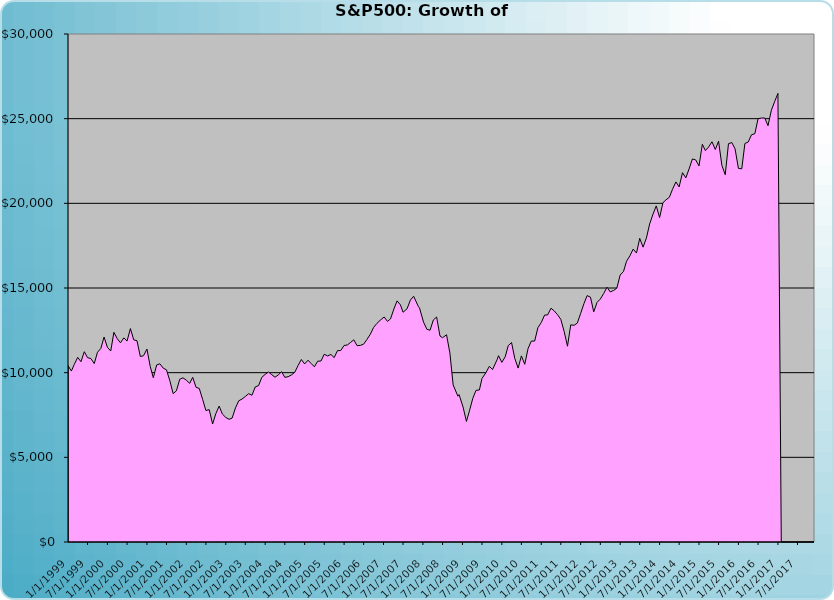
| Category | S&P500 |
|---|---|
| 12/1/17 | 0 |
| 11/1/17 | 0 |
| 10/1/17 | 0 |
| 9/1/17 | 0 |
| 8/1/17 | 0 |
| 7/1/17 | 0 |
| 6/1/17 | 0 |
| 5/1/17 | 0 |
| 4/1/17 | 0 |
| 3/1/17 | 0 |
| 2/1/17 | 0 |
| 1/1/17 | 26493.548 |
| 12/1/16 | 25999.557 |
| 11/1/16 | 25494.761 |
| 10/1/16 | 24585.111 |
| 9/1/16 | 25040.855 |
| 8/1/16 | 25035.848 |
| 7/1/16 | 25000.847 |
| 6/1/16 | 24111.145 |
| 5/1/16 | 24048.619 |
| 4/1/16 | 23623.398 |
| 3/1/16 | 23531.624 |
| 2/1/16 | 22037.483 |
| 1/1/16 | 22066.169 |
| 12/1/15 | 23217.771 |
| 11/1/15 | 23590.5 |
| 10/1/15 | 23519.941 |
| 9/1/15 | 21689.359 |
| 8/1/15 | 22238.653 |
| 7/1/15 | 23665.695 |
| 6/1/15 | 23178.937 |
| 5/1/15 | 23637.505 |
| 4/1/15 | 23336.464 |
| 3/1/15 | 23114.565 |
| 2/1/15 | 23485.638 |
| 1/1/15 | 22208.641 |
| 12/1/14 | 22565.171 |
| 11/1/14 | 22621.725 |
| 10/1/14 | 22029.141 |
| 9/1/14 | 21504.433 |
| 8/1/14 | 21809.77 |
| 7/1/14 | 20970.932 |
| 6/1/14 | 21264.381 |
| 5/1/14 | 20833.135 |
| 4/1/14 | 20354.797 |
| 3/1/14 | 20205.278 |
| 2/1/14 | 20036.968 |
| 1/1/14 | 19161.296 |
| 12/1/13 | 19848.038 |
| 11/1/13 | 19358.274 |
| 10/1/13 | 18785.322 |
| 9/1/13 | 17959.199 |
| 8/1/13 | 17412.448 |
| 7/1/13 | 17932.49 |
| 6/1/13 | 17063.936 |
| 5/1/13 | 17295.698 |
| 4/1/13 | 16900.233 |
| 3/1/13 | 16580.234 |
| 2/1/13 | 15980.948 |
| 1/1/13 | 15766.524 |
| 12/1/12 | 14990.04 |
| 11/1/12 | 14854.86 |
| 10/1/12 | 14769.199 |
| 9/1/12 | 15047.579 |
| 8/1/12 | 14669.116 |
| 7/1/12 | 14346.324 |
| 6/1/12 | 14149.644 |
| 5/1/12 | 13589.746 |
| 4/1/12 | 14458.715 |
| 3/1/12 | 14550.382 |
| 2/1/12 | 14086.923 |
| 1/1/12 | 13503.569 |
| 12/1/11 | 12927.023 |
| 11/1/11 | 12796.499 |
| 10/1/11 | 12824.713 |
| 9/1/11 | 11561.087 |
| 8/1/11 | 12435.287 |
| 7/1/11 | 13149.294 |
| 6/1/11 | 13421.756 |
| 5/1/11 | 13649.706 |
| 4/1/11 | 13805.71 |
| 3/1/11 | 13408.809 |
| 2/1/11 | 13403.448 |
| 1/1/11 | 12958.956 |
| 12/1/10 | 12658.939 |
| 11/1/10 | 11866.272 |
| 10/1/10 | 11865.086 |
| 9/1/10 | 11430.718 |
| 8/1/10 | 10494.6 |
| 7/1/10 | 10990.261 |
| 6/1/10 | 10270.312 |
| 5/1/10 | 10837.092 |
| 4/1/10 | 11778.167 |
| 3/1/10 | 11594.967 |
| 2/1/10 | 10935.553 |
| 1/1/10 | 10606.744 |
| 12/1/09 | 11002.846 |
| 11/20/09 | 10794.512 |
| 10/7/09 | 10183.502 |
| 9/7/09 | 10376.505 |
| 8/7/09 | 10003.379 |
| 7/1/09 | 9654.839 |
| 6/7/09 | 8976.236 |
| 5/7/09 | 8958.319 |
| 4/7/09 | 8484.06 |
| 3/7/09 | 7743.05 |
| 2/7/09 | 7119.392 |
| 1/7/09 | 7967.982 |
| 12/1/08 | 8701.52 |
| 11/20/08 | 8610.251 |
| 10/7/08 | 9276.289 |
| 9/7/08 | 11148.046 |
| 8/7/08 | 12238.496 |
| 7/1/08 | 12063.574 |
| 6/7/08 | 12165.766 |
| 5/7/08 | 13285.755 |
| 4/7/08 | 13115.257 |
| 3/7/08 | 12506.205 |
| 2/7/08 | 12560.214 |
| 1/7/08 | 12982.133 |
| 12/1/07 | 13810.78 |
| 11/20/07 | 13906.736 |
| 10/7/07 | 14513.396 |
| 9/7/07 | 14286.245 |
| 8/7/07 | 13771.202 |
| 7/1/07 | 13567.687 |
| 6/7/07 | 14001.741 |
| 5/7/07 | 14238.093 |
| 4/7/07 | 13757.941 |
| 3/7/07 | 13174.319 |
| 2/7/07 | 13028.401 |
| 1/7/07 | 13288.862 |
| 12/1/06 | 13091.185 |
| 11/1/06 | 12910.439 |
| 10/1/06 | 12669.715 |
| 9/1/06 | 12269.722 |
| 8/1/06 | 11961.125 |
| 7/1/06 | 11683.068 |
| 6/1/06 | 11611.079 |
| 5/1/06 | 11594.846 |
| 4/1/06 | 11938.68 |
| 3/1/06 | 11780.817 |
| 2/1/06 | 11636.524 |
| 1/1/06 | 11605.19 |
| 12/1/05 | 11305.592 |
| 11/1/05 | 11302.201 |
| 10/1/05 | 10890.539 |
| 9/1/05 | 11075.5 |
| 8/1/05 | 10986.509 |
| 7/1/05 | 11087.405 |
| 6/1/05 | 10689.746 |
| 5/1/05 | 10674.801 |
| 4/1/05 | 10345.805 |
| 3/1/05 | 10546.182 |
| 2/1/05 | 10736.213 |
| 1/1/05 | 10515.39 |
| 12/1/04 | 10778.383 |
| 11/1/04 | 10423.968 |
| 10/1/04 | 10018.229 |
| 9/1/04 | 9867.26 |
| 8/1/04 | 9761.832 |
| 7/1/04 | 9722.941 |
| 6/1/04 | 10055.787 |
| 5/1/04 | 9864.418 |
| 4/1/04 | 9731.101 |
| 3/1/04 | 9886.317 |
| 2/1/04 | 10037.889 |
| 1/1/04 | 9900.275 |
| 12/1/03 | 9721.401 |
| 11/1/03 | 9237.363 |
| 10/1/03 | 9156.784 |
| 9/1/03 | 8666.273 |
| 8/1/03 | 8759.119 |
| 7/1/03 | 8591.583 |
| 6/1/03 | 8442.987 |
| 5/1/03 | 8336.282 |
| 4/1/03 | 7918.954 |
| 3/1/03 | 7316.106 |
| 2/1/03 | 7245.822 |
| 1/1/03 | 7356.164 |
| 12/1/02 | 7554.081 |
| 11/1/02 | 8025.158 |
| 10/1/02 | 7578.769 |
| 9/1/02 | 6965.78 |
| 8/1/02 | 7815.303 |
| 7/1/02 | 7764.061 |
| 6/1/02 | 8420.89 |
| 5/1/02 | 9066.419 |
| 4/1/02 | 9134.011 |
| 3/1/02 | 9723.239 |
| 2/1/02 | 9370.894 |
| 1/1/02 | 9555.311 |
| 12/1/01 | 9696.886 |
| 11/1/01 | 9612.297 |
| 10/1/01 | 8927.554 |
| 9/1/01 | 8760.233 |
| 8/1/01 | 9530.28 |
| 7/1/01 | 10166.717 |
| 6/1/01 | 10267.336 |
| 5/1/01 | 10523.046 |
| 4/1/01 | 10453.011 |
| 3/1/01 | 9699.37 |
| 2/1/01 | 10355.937 |
| 1/1/01 | 11395.177 |
| 12/1/00 | 11004.516 |
| 11/1/00 | 10950.857 |
| 10/1/00 | 11887.6 |
| 9/1/00 | 11937.739 |
| 8/1/00 | 12603.187 |
| 7/1/00 | 11866.29 |
| 6/1/00 | 12054.338 |
| 5/1/00 | 11763.773 |
| 4/1/00 | 12009.977 |
| 3/1/00 | 12382.696 |
| 2/1/00 | 11279.556 |
| 1/1/00 | 11496.846 |
| 12/1/99 | 12104.492 |
| 11/1/99 | 11431.194 |
| 10/1/99 | 11203.758 |
| 9/1/99 | 10536.78 |
| 8/1/99 | 10833.621 |
| 7/1/99 | 10886.967 |
| 6/1/99 | 11237.58 |
| 5/1/99 | 10646.689 |
| 4/1/99 | 10904.024 |
| 3/1/99 | 10497.76 |
| 2/1/99 | 10094 |
| 1/1/99 | 10418 |